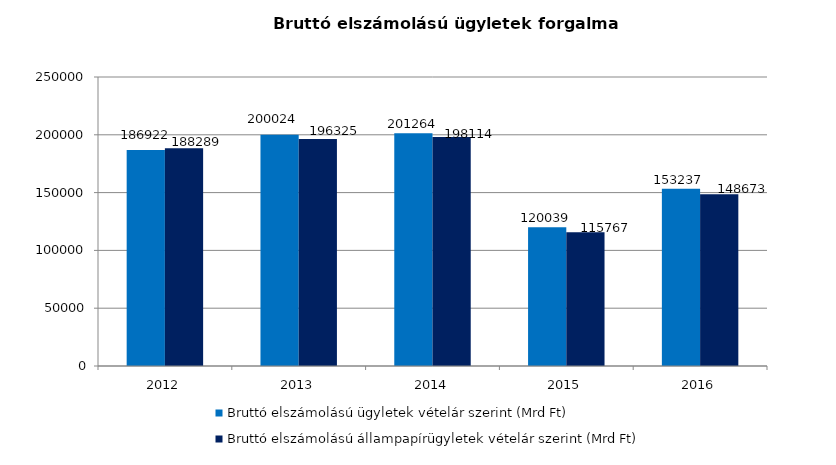
| Category | Bruttó elszámolású ügyletek vételár szerint (Mrd Ft) | Bruttó elszámolású állampapírügyletek vételár szerint (Mrd Ft) |
|---|---|---|
| 2012.0 | 186922 | 188289 |
| 2013.0 | 200024 | 196325 |
| 2014.0 | 201264 | 198114 |
| 2015.0 | 120039 | 115767 |
| 2016.0 | 153237 | 148673 |